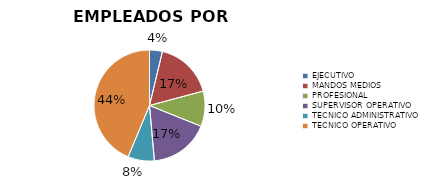
| Category | Series 0 |
|---|---|
| EJECUTIVO | 102 |
| MANDOS MEDIOS | 466 |
| PROFESIONAL | 280 |
| SUPERVISOR OPERATIVO | 477 |
| TECNICO ADMINISTRATIVO | 210 |
| TECNICO OPERATIVO | 1192 |